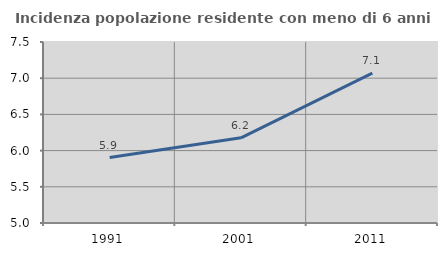
| Category | Incidenza popolazione residente con meno di 6 anni |
|---|---|
| 1991.0 | 5.904 |
| 2001.0 | 6.177 |
| 2011.0 | 7.07 |